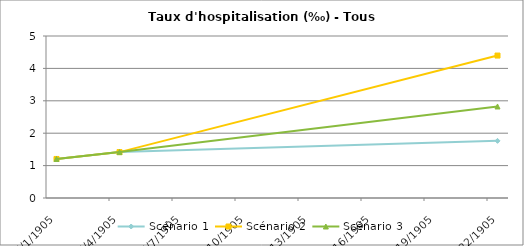
| Category | Scénario 1 | Scénario 2 | Scénario 3 |
|---|---|---|---|
| 2009.0 | 1.205 | 1.205 | 1.205 |
| 2012.0 | 1.416 | 1.416 | 1.416 |
| 2030.0 | 1.764 | 4.396 | 2.825 |